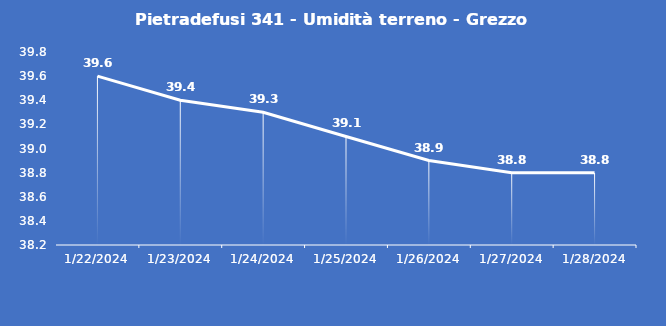
| Category | Pietradefusi 341 - Umidità terreno - Grezzo (%VWC) |
|---|---|
| 1/22/24 | 39.6 |
| 1/23/24 | 39.4 |
| 1/24/24 | 39.3 |
| 1/25/24 | 39.1 |
| 1/26/24 | 38.9 |
| 1/27/24 | 38.8 |
| 1/28/24 | 38.8 |